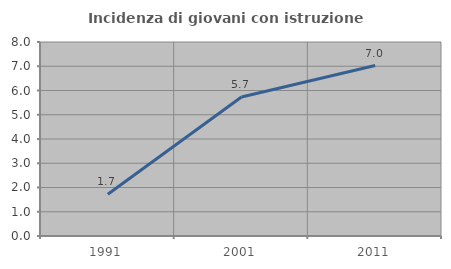
| Category | Incidenza di giovani con istruzione universitaria |
|---|---|
| 1991.0 | 1.724 |
| 2001.0 | 5.735 |
| 2011.0 | 7.029 |